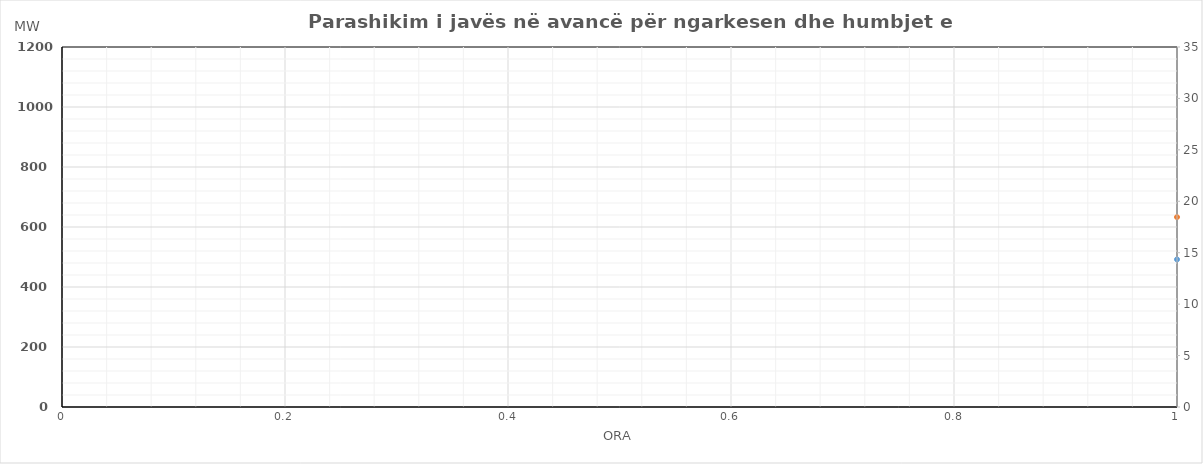
| Category | Ngarkesa (MWh) |
|---|---|
| 0 | 633 |
| 1 | 577 |
| 2 | 538 |
| 3 | 524 |
| 4 | 535 |
| 5 | 568 |
| 6 | 685 |
| 7 | 813 |
| 8 | 904 |
| 9 | 924 |
| 10 | 930 |
| 11 | 942 |
| 12 | 940 |
| 13 | 940 |
| 14 | 912 |
| 15 | 882 |
| 16 | 879 |
| 17 | 898 |
| 18 | 926 |
| 19 | 934 |
| 20 | 967 |
| 21 | 943 |
| 22 | 829 |
| 23 | 699 |
| 24 | 615 |
| 25 | 562 |
| 26 | 529 |
| 27 | 526 |
| 28 | 534 |
| 29 | 562 |
| 30 | 652 |
| 31 | 767 |
| 32 | 868 |
| 33 | 907 |
| 34 | 924 |
| 35 | 935 |
| 36 | 932 |
| 37 | 927 |
| 38 | 904 |
| 39 | 871 |
| 40 | 860 |
| 41 | 886 |
| 42 | 912 |
| 43 | 927 |
| 44 | 959 |
| 45 | 946 |
| 46 | 849 |
| 47 | 715 |
| 48 | 692 |
| 49 | 629 |
| 50 | 602 |
| 51 | 587 |
| 52 | 589 |
| 53 | 615 |
| 54 | 703 |
| 55 | 841 |
| 56 | 938 |
| 57 | 994 |
| 58 | 1017 |
| 59 | 1033 |
| 60 | 942 |
| 61 | 919 |
| 62 | 879 |
| 63 | 847 |
| 64 | 844 |
| 65 | 874 |
| 66 | 893 |
| 67 | 895 |
| 68 | 937 |
| 69 | 904 |
| 70 | 805 |
| 71 | 698 |
| 72 | 694 |
| 73 | 628 |
| 74 | 598 |
| 75 | 581 |
| 76 | 579 |
| 77 | 608 |
| 78 | 699 |
| 79 | 830 |
| 80 | 937 |
| 81 | 983 |
| 82 | 1014 |
| 83 | 1031 |
| 84 | 1040 |
| 85 | 1048 |
| 86 | 1033 |
| 87 | 1010 |
| 88 | 989 |
| 89 | 990 |
| 90 | 1004 |
| 91 | 994 |
| 92 | 1009 |
| 93 | 1009 |
| 94 | 914 |
| 95 | 771 |
| 96 | 689 |
| 97 | 625 |
| 98 | 599 |
| 99 | 580 |
| 100 | 584 |
| 101 | 610 |
| 102 | 693 |
| 103 | 812 |
| 104 | 921 |
| 105 | 985 |
| 106 | 1016 |
| 107 | 1041 |
| 108 | 1059 |
| 109 | 1061 |
| 110 | 1050 |
| 111 | 1012 |
| 112 | 997 |
| 113 | 993 |
| 114 | 1005 |
| 115 | 988 |
| 116 | 1008 |
| 117 | 1011 |
| 118 | 915 |
| 119 | 795 |
| 120 | 733 |
| 121 | 665 |
| 122 | 630 |
| 123 | 611 |
| 124 | 605 |
| 125 | 633 |
| 126 | 719 |
| 127 | 856 |
| 128 | 970 |
| 129 | 1025 |
| 130 | 1045 |
| 131 | 1085 |
| 132 | 1092 |
| 133 | 1096 |
| 134 | 1080 |
| 135 | 1051 |
| 136 | 1023 |
| 137 | 1028 |
| 138 | 1036 |
| 139 | 1018 |
| 140 | 1036 |
| 141 | 1040 |
| 142 | 941 |
| 143 | 791 |
| 144 | 736 |
| 145 | 668 |
| 146 | 640 |
| 147 | 620 |
| 148 | 617 |
| 149 | 637 |
| 150 | 708 |
| 151 | 806 |
| 152 | 894 |
| 153 | 943 |
| 154 | 977 |
| 155 | 1003 |
| 156 | 1036 |
| 157 | 1036 |
| 158 | 1003 |
| 159 | 987 |
| 160 | 1003 |
| 161 | 1027 |
| 162 | 1049 |
| 163 | 1061 |
| 164 | 1086 |
| 165 | 1096 |
| 166 | 1003 |
| 167 | 862 |